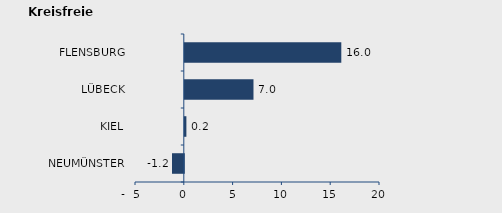
| Category | Wanderungssaldo |
|---|---|
| NEUMÜNSTER | -1.208 |
| KIEL | 0.162 |
| LÜBECK | 7.037 |
| FLENSBURG | 16.035 |